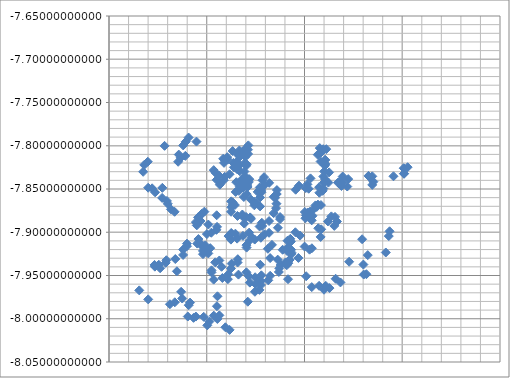
| Category | Y |
|---|---|
| 110.336646111 | -7.842 |
| 110.333785 | -7.847 |
| 110.330225086 | -7.842 |
| 110.335730074 | -7.839 |
| 110.34077805 | -7.839 |
| 110.339209051 | -7.835 |
| 110.33853005 | -7.83 |
| 110.323341106 | -7.833 |
| 110.31843309 | -7.836 |
| 110.317431047 | -7.84 |
| 110.310145102 | -7.839 |
| 110.31334804 | -7.845 |
| 110.330920101 | -7.827 |
| 110.327802071 | -7.825 |
| 110.332890096 | -7.823 |
| 110.333969 | -7.813 |
| 110.316829106 | -7.815 |
| 110.317684 | -7.82 |
| 110.340290093 | -7.823 |
| 110.312673054 | -7.835 |
| 110.30891307 | -7.831 |
| 110.307144 | -7.828 |
| 110.346185096 | -7.906 |
| 110.340587074 | -7.915 |
| 110.349067066 | -7.908 |
| 110.324743043 | -7.909 |
| 110.32930104 | -7.902 |
| 110.340354065 | -7.882 |
| 110.344024092 | -7.909 |
| 110.337039 | -7.904 |
| 110.343372571 | -7.9 |
| 110.340773 | -7.918 |
| 110.368573044 | -7.859 |
| 110.371611066 | -7.856 |
| 110.371782092 | -7.851 |
| 110.369918049 | -7.86 |
| 110.371319094 | -7.867 |
| 110.370933092 | -7.872 |
| 110.36846206 | -7.878 |
| 110.354592099 | -7.87 |
| 110.348706107 | -7.869 |
| 110.348472094 | -7.865 |
| 110.345147042 | -7.862 |
| 110.350942102 | -7.867 |
| 110.354554069 | -7.86 |
| 110.356053093 | -7.854 |
| 110.352103047 | -7.853 |
| 110.35925408 | -7.845 |
| 110.358675107 | -7.836 |
| 110.357013079 | -7.84 |
| 110.363835039 | -7.843 |
| 110.327267061 | -7.82 |
| 110.32142409 | -7.816 |
| 110.320939076 | -7.813 |
| 110.326516 | -7.806 |
| 110.246585044 | -7.938 |
| 110.252307049 | -7.942 |
| 110.250964067 | -7.938 |
| 110.25871005 | -7.932 |
| 110.267819056 | -7.931 |
| 110.240105104 | -7.978 |
| 110.230953061 | -7.967 |
| 110.273814064 | -7.969 |
| 110.267309038 | -7.981 |
| 110.262333112 | -7.983 |
| 110.274905044 | -7.977 |
| 110.28290404 | -7.981 |
| 110.281551101 | -7.984 |
| 110.280604038 | -7.997 |
| 110.279721058 | -7.913 |
| 110.290286085 | -7.913 |
| 110.291481102 | -7.908 |
| 110.293764107 | -7.913 |
| 110.279718062 | -7.916 |
| 110.275855103 | -7.92 |
| 110.275796076 | -7.926 |
| 110.304665079 | -7.901 |
| 110.309888102 | -7.897 |
| 110.31053506 | -7.894 |
| 110.300153079 | -7.902 |
| 110.298528042 | -7.915 |
| 110.296163112 | -7.925 |
| 110.269493045 | -7.945 |
| 110.270735096 | -7.819 |
| 110.271394081 | -7.81 |
| 110.275873096 | -7.8 |
| 110.278518056 | -7.795 |
| 110.281418103 | -7.791 |
| 110.236058091 | -7.822 |
| 110.234972042 | -7.83 |
| 110.273330075 | -7.814 |
| 110.27810607 | -7.812 |
| 110.289474497 | -7.795 |
| 110.25687 | -7.8 |
| 110.239669113 | -7.818 |
| 110.291131043 | -7.883 |
| 110.29470906 | -7.879 |
| 110.297576 | -7.876 |
| 110.293684101 | -7.887 |
| 110.29470906 | -7.879 |
| 110.322032043 | -7.949 |
| 110.324797072 | -7.942 |
| 110.325491089 | -7.936 |
| 110.331782038 | -7.931 |
| 110.321635068 | -7.954 |
| 110.315989069 | -7.953 |
| 110.307059112 | -7.955 |
| 110.30488005 | -7.946 |
| 110.304898073 | -7.944 |
| 110.308656109 | -7.935 |
| 110.312892103 | -7.933 |
| 110.331538043 | -7.935 |
| 110.315152055 | -7.94 |
| 110.296901046 | -7.998 |
| 110.288884045 | -7.997 |
| 110.286477094 | -7.999 |
| 110.310858116 | -8 |
| 110.312911082 | -7.996 |
| 110.310431059 | -7.986 |
| 110.310964057 | -7.974 |
| 110.319062043 | -8.01 |
| 110.32340303 | -8.013 |
| 110.300548114 | -8.008 |
| 110.302734612 | -8.003 |
| 110.307194112 | -7.996 |
| 110.3553441 | -7.956 |
| 110.349513053 | -7.952 |
| 110.34294608 | -7.951 |
| 110.340554088 | -7.946 |
| 110.332442066 | -7.949 |
| 110.344113078 | -7.958 |
| 110.364910077 | -7.95 |
| 110.362918091 | -7.956 |
| 110.355881049 | -7.95 |
| 110.350089083 | -7.96 |
| 110.3553441 | -7.956 |
| 110.341995088 | -7.98 |
| 110.362538091 | -7.919 |
| 110.364850066 | -7.93 |
| 110.354757066 | -7.938 |
| 110.366698072 | -7.915 |
| 110.372831046 | -7.895 |
| 110.375000107 | -7.885 |
| 110.375 | -7.882 |
| 110.363743 | -7.887 |
| 110.363732082 | -7.901 |
| 110.359061104 | -7.902 |
| 110.355337064 | -7.906 |
| 110.386311053 | -7.92 |
| 110.3866 | -7.923 |
| 110.382248 | -7.922 |
| 110.383034046 | -7.917 |
| 110.38610805 | -7.911 |
| 110.385489053 | -7.908 |
| 110.375589079 | -7.938 |
| 110.374255062 | -7.942 |
| 110.373765099 | -7.946 |
| 110.380277055 | -7.935 |
| 110.384699099 | -7.932 |
| 110.384699099 | -7.932 |
| 110.393750078 | -7.93 |
| 110.3863921 | -7.925 |
| 110.3863921 | -7.925 |
| 110.372589055 | -7.932 |
| 110.383139105 | -7.954 |
| 110.382608111 | -7.91 |
| 110.390652076 | -7.9 |
| 110.377662077 | -7.92 |
| 110.400115047 | -7.917 |
| 110.395469053 | -7.904 |
| 110.486232113 | -7.904 |
| 110.401460106 | -7.88 |
| 110.400981097 | -7.884 |
| 110.408224084 | -7.881 |
| 110.407373086 | -7.886 |
| 110.433242043 | -7.888 |
| 110.43121 | -7.882 |
| 110.42748909 | -7.882 |
| 110.430470094 | -7.893 |
| 110.424008074 | -7.887 |
| 110.416813084 | -7.869 |
| 110.419900087 | -7.843 |
| 110.421003112 | -7.839 |
| 110.420135 | -7.83 |
| 110.420841059 | -7.823 |
| 110.421509052 | -7.821 |
| 110.416485049 | -7.818 |
| 110.421112064 | -7.816 |
| 110.416810095 | -7.808 |
| 110.413546076 | -7.81 |
| 110.41560908 | -7.803 |
| 110.422294621 | -7.804 |
| 110.419148071 | -7.804 |
| 110.425160063 | -7.831 |
| 110.424430045 | -7.843 |
| 110.419286049 | -7.85 |
| 110.41856807 | -7.852 |
| 110.414964048 | -7.848 |
| 110.415194075 | -7.854 |
| 110.419293064 | -7.836 |
| 110.421112064 | -7.816 |
| 110.416810095 | -7.808 |
| 110.434262054 | -7.843 |
| 110.436285088 | -7.841 |
| 110.438767105 | -7.842 |
| 110.437792057 | -7.846 |
| 110.444738097 | -7.839 |
| 110.439100061 | -7.836 |
| 110.470481057 | -7.842 |
| 110.466556106 | -7.836 |
| 110.443751072 | -7.847 |
| 110.46934509 | -7.835 |
| 110.505489212 | -7.825 |
| 110.501485076 | -7.826 |
| 110.501807436 | -7.832 |
| 110.501807436 | -7.832 |
| 110.491028085 | -7.835 |
| 110.487039471 | -7.899 |
| 110.483143 | -7.923 |
| 110.401725453 | -7.951 |
| 110.331052918 | -7.907 |
| 110.325063507 | -7.901 |
| 110.325135 | -7.871 |
| 110.328777 | -7.869 |
| 110.331427257 | -7.881 |
| 110.336768 | -7.882 |
| 110.322255971 | -7.904 |
| 110.354074718 | -7.893 |
| 110.356695086 | -7.893 |
| 110.356320748 | -7.889 |
| 110.336431 | -7.879 |
| 110.324876338 | -7.876 |
| 110.338352514 | -7.89 |
| 110.326485992 | -7.868 |
| 110.326471057 | -7.865 |
| 110.325036105 | -7.864 |
| 110.344454226 | -7.883 |
| 110.345202903 | -7.885 |
| 110.332920112 | -7.852 |
| 110.333491 | -7.85 |
| 110.337026105 | -7.848 |
| 110.340891043 | -7.856 |
| 110.337940056 | -7.859 |
| 110.329608084 | -7.853 |
| 110.355663068 | -7.851 |
| 110.354227048 | -7.848 |
| 110.333791105 | -7.829 |
| 110.340885065 | -7.821 |
| 110.339017088 | -7.82 |
| 110.34306105 | -7.842 |
| 110.343583067 | -7.839 |
| 110.341434067 | -7.845 |
| 110.341771075 | -7.848 |
| 110.330695045 | -7.818 |
| 110.333557071 | -7.808 |
| 110.33334104 | -7.805 |
| 110.337678705 | -7.809 |
| 110.331697 | -7.81 |
| 110.333989038 | -7.809 |
| 110.340111903 | -7.803 |
| 110.342545102 | -7.8 |
| 110.34227905 | -7.809 |
| 110.339392 | -7.813 |
| 110.342170763 | -7.805 |
| 110.336930028 | -7.806 |
| 110.310152 | -7.88 |
| 110.301608077 | -7.891 |
| 110.288884053 | -7.888 |
| 110.289810097 | -7.892 |
| 110.267115952 | -7.876 |
| 110.26339005 | -7.873 |
| 110.260115054 | -7.867 |
| 110.259240103 | -7.864 |
| 110.254350085 | -7.86 |
| 110.247187089 | -7.854 |
| 110.240104111 | -7.849 |
| 110.244094152 | -7.849 |
| 110.254575622 | -7.849 |
| 110.303589111 | -7.918 |
| 110.296114097 | -7.922 |
| 110.295804045 | -7.917 |
| 110.299282047 | -7.918 |
| 110.301611055 | -7.924 |
| 110.246941038 | -7.94 |
| 110.258000051 | -7.935 |
| 110.349282087 | -7.969 |
| 110.353964051 | -7.967 |
| 110.35545107 | -7.961 |
| 110.404273473 | -7.85 |
| 110.401278767 | -7.849 |
| 110.402963289 | -7.845 |
| 110.39435351 | -7.846 |
| 110.390984466 | -7.851 |
| 110.406145164 | -7.838 |
| 110.41119873 | -7.869 |
| 110.413753072 | -7.868 |
| 110.412528093 | -7.871 |
| 110.405648046 | -7.876 |
| 110.403494086 | -7.877 |
| 110.400342921 | -7.877 |
| 110.407829686 | -7.875 |
| 110.469298102 | -7.845 |
| 110.465444073 | -7.835 |
| 110.404647091 | -7.882 |
| 110.458964285 | -7.908 |
| 110.445683045 | -7.934 |
| 110.464709078 | -7.926 |
| 110.463316053 | -7.949 |
| 110.46060707 | -7.949 |
| 110.460257095 | -7.937 |
| 110.436766106 | -7.958 |
| 110.431848049 | -7.954 |
| 110.414958108 | -7.962 |
| 110.407425082 | -7.963 |
| 110.419977104 | -7.966 |
| 110.421756097 | -7.962 |
| 110.42557104 | -7.965 |
| 110.383474092 | -7.936 |
| 110.38187509 | -7.938 |
| 110.41651611 | -7.905 |
| 110.4170881 | -7.897 |
| 110.414089046 | -7.895 |
| 110.407557075 | -7.919 |
| 110.40519306 | -7.92 |